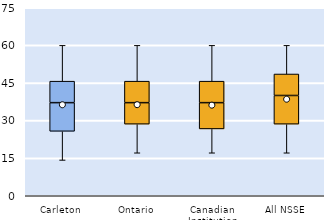
| Category | 25th | 50th | 75th |
|---|---|---|---|
| Carleton | 25.714 | 11.429 | 8.571 |
| Ontario | 28.571 | 8.571 | 8.571 |
| Canadian Institution | 26.667 | 10.476 | 8.571 |
| All NSSE | 28.571 | 11.429 | 8.571 |